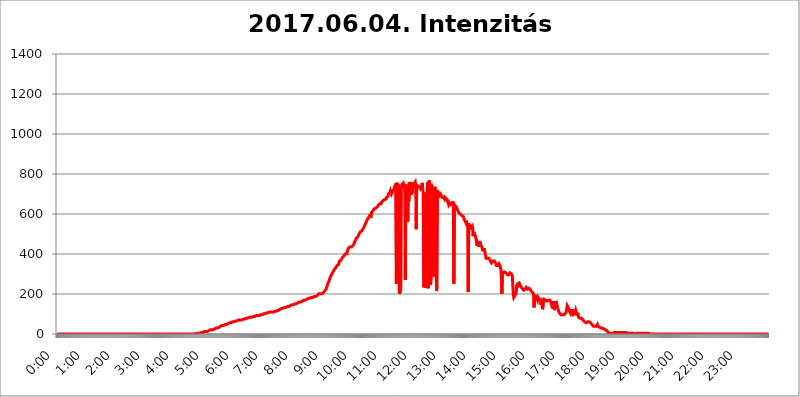
| Category | 2017.06.04. Intenzitás [W/m^2]04 |
|---|---|
| 0.0 | 0 |
| 0.0006944444444444445 | 0 |
| 0.001388888888888889 | 0 |
| 0.0020833333333333333 | 0 |
| 0.002777777777777778 | 0 |
| 0.003472222222222222 | 0 |
| 0.004166666666666667 | 0 |
| 0.004861111111111111 | 0 |
| 0.005555555555555556 | 0 |
| 0.0062499999999999995 | 0 |
| 0.006944444444444444 | 0 |
| 0.007638888888888889 | 0 |
| 0.008333333333333333 | 0 |
| 0.009027777777777779 | 0 |
| 0.009722222222222222 | 0 |
| 0.010416666666666666 | 0 |
| 0.011111111111111112 | 0 |
| 0.011805555555555555 | 0 |
| 0.012499999999999999 | 0 |
| 0.013194444444444444 | 0 |
| 0.013888888888888888 | 0 |
| 0.014583333333333332 | 0 |
| 0.015277777777777777 | 0 |
| 0.015972222222222224 | 0 |
| 0.016666666666666666 | 0 |
| 0.017361111111111112 | 0 |
| 0.018055555555555557 | 0 |
| 0.01875 | 0 |
| 0.019444444444444445 | 0 |
| 0.02013888888888889 | 0 |
| 0.020833333333333332 | 0 |
| 0.02152777777777778 | 0 |
| 0.022222222222222223 | 0 |
| 0.02291666666666667 | 0 |
| 0.02361111111111111 | 0 |
| 0.024305555555555556 | 0 |
| 0.024999999999999998 | 0 |
| 0.025694444444444447 | 0 |
| 0.02638888888888889 | 0 |
| 0.027083333333333334 | 0 |
| 0.027777777777777776 | 0 |
| 0.02847222222222222 | 0 |
| 0.029166666666666664 | 0 |
| 0.029861111111111113 | 0 |
| 0.030555555555555555 | 0 |
| 0.03125 | 0 |
| 0.03194444444444445 | 0 |
| 0.03263888888888889 | 0 |
| 0.03333333333333333 | 0 |
| 0.034027777777777775 | 0 |
| 0.034722222222222224 | 0 |
| 0.035416666666666666 | 0 |
| 0.036111111111111115 | 0 |
| 0.03680555555555556 | 0 |
| 0.0375 | 0 |
| 0.03819444444444444 | 0 |
| 0.03888888888888889 | 0 |
| 0.03958333333333333 | 0 |
| 0.04027777777777778 | 0 |
| 0.04097222222222222 | 0 |
| 0.041666666666666664 | 0 |
| 0.042361111111111106 | 0 |
| 0.04305555555555556 | 0 |
| 0.043750000000000004 | 0 |
| 0.044444444444444446 | 0 |
| 0.04513888888888889 | 0 |
| 0.04583333333333334 | 0 |
| 0.04652777777777778 | 0 |
| 0.04722222222222222 | 0 |
| 0.04791666666666666 | 0 |
| 0.04861111111111111 | 0 |
| 0.049305555555555554 | 0 |
| 0.049999999999999996 | 0 |
| 0.05069444444444445 | 0 |
| 0.051388888888888894 | 0 |
| 0.052083333333333336 | 0 |
| 0.05277777777777778 | 0 |
| 0.05347222222222222 | 0 |
| 0.05416666666666667 | 0 |
| 0.05486111111111111 | 0 |
| 0.05555555555555555 | 0 |
| 0.05625 | 0 |
| 0.05694444444444444 | 0 |
| 0.057638888888888885 | 0 |
| 0.05833333333333333 | 0 |
| 0.05902777777777778 | 0 |
| 0.059722222222222225 | 0 |
| 0.06041666666666667 | 0 |
| 0.061111111111111116 | 0 |
| 0.06180555555555556 | 0 |
| 0.0625 | 0 |
| 0.06319444444444444 | 0 |
| 0.06388888888888888 | 0 |
| 0.06458333333333334 | 0 |
| 0.06527777777777778 | 0 |
| 0.06597222222222222 | 0 |
| 0.06666666666666667 | 0 |
| 0.06736111111111111 | 0 |
| 0.06805555555555555 | 0 |
| 0.06874999999999999 | 0 |
| 0.06944444444444443 | 0 |
| 0.07013888888888889 | 0 |
| 0.07083333333333333 | 0 |
| 0.07152777777777779 | 0 |
| 0.07222222222222223 | 0 |
| 0.07291666666666667 | 0 |
| 0.07361111111111111 | 0 |
| 0.07430555555555556 | 0 |
| 0.075 | 0 |
| 0.07569444444444444 | 0 |
| 0.0763888888888889 | 0 |
| 0.07708333333333334 | 0 |
| 0.07777777777777778 | 0 |
| 0.07847222222222222 | 0 |
| 0.07916666666666666 | 0 |
| 0.0798611111111111 | 0 |
| 0.08055555555555556 | 0 |
| 0.08125 | 0 |
| 0.08194444444444444 | 0 |
| 0.08263888888888889 | 0 |
| 0.08333333333333333 | 0 |
| 0.08402777777777777 | 0 |
| 0.08472222222222221 | 0 |
| 0.08541666666666665 | 0 |
| 0.08611111111111112 | 0 |
| 0.08680555555555557 | 0 |
| 0.08750000000000001 | 0 |
| 0.08819444444444445 | 0 |
| 0.08888888888888889 | 0 |
| 0.08958333333333333 | 0 |
| 0.09027777777777778 | 0 |
| 0.09097222222222222 | 0 |
| 0.09166666666666667 | 0 |
| 0.09236111111111112 | 0 |
| 0.09305555555555556 | 0 |
| 0.09375 | 0 |
| 0.09444444444444444 | 0 |
| 0.09513888888888888 | 0 |
| 0.09583333333333333 | 0 |
| 0.09652777777777777 | 0 |
| 0.09722222222222222 | 0 |
| 0.09791666666666667 | 0 |
| 0.09861111111111111 | 0 |
| 0.09930555555555555 | 0 |
| 0.09999999999999999 | 0 |
| 0.10069444444444443 | 0 |
| 0.1013888888888889 | 0 |
| 0.10208333333333335 | 0 |
| 0.10277777777777779 | 0 |
| 0.10347222222222223 | 0 |
| 0.10416666666666667 | 0 |
| 0.10486111111111111 | 0 |
| 0.10555555555555556 | 0 |
| 0.10625 | 0 |
| 0.10694444444444444 | 0 |
| 0.1076388888888889 | 0 |
| 0.10833333333333334 | 0 |
| 0.10902777777777778 | 0 |
| 0.10972222222222222 | 0 |
| 0.1111111111111111 | 0 |
| 0.11180555555555556 | 0 |
| 0.11180555555555556 | 0 |
| 0.1125 | 0 |
| 0.11319444444444444 | 0 |
| 0.11388888888888889 | 0 |
| 0.11458333333333333 | 0 |
| 0.11527777777777777 | 0 |
| 0.11597222222222221 | 0 |
| 0.11666666666666665 | 0 |
| 0.1173611111111111 | 0 |
| 0.11805555555555557 | 0 |
| 0.11944444444444445 | 0 |
| 0.12013888888888889 | 0 |
| 0.12083333333333333 | 0 |
| 0.12152777777777778 | 0 |
| 0.12222222222222223 | 0 |
| 0.12291666666666667 | 0 |
| 0.12291666666666667 | 0 |
| 0.12361111111111112 | 0 |
| 0.12430555555555556 | 0 |
| 0.125 | 0 |
| 0.12569444444444444 | 0 |
| 0.12638888888888888 | 0 |
| 0.12708333333333333 | 0 |
| 0.16875 | 0 |
| 0.12847222222222224 | 0 |
| 0.12916666666666668 | 0 |
| 0.12986111111111112 | 0 |
| 0.13055555555555556 | 0 |
| 0.13125 | 0 |
| 0.13194444444444445 | 0 |
| 0.1326388888888889 | 0 |
| 0.13333333333333333 | 0 |
| 0.13402777777777777 | 0 |
| 0.13402777777777777 | 0 |
| 0.13472222222222222 | 0 |
| 0.13541666666666666 | 0 |
| 0.1361111111111111 | 0 |
| 0.13749999999999998 | 0 |
| 0.13819444444444443 | 0 |
| 0.1388888888888889 | 0 |
| 0.13958333333333334 | 0 |
| 0.14027777777777778 | 0 |
| 0.14097222222222222 | 0 |
| 0.14166666666666666 | 0 |
| 0.1423611111111111 | 0 |
| 0.14305555555555557 | 0 |
| 0.14375000000000002 | 0 |
| 0.14444444444444446 | 0 |
| 0.1451388888888889 | 0 |
| 0.1451388888888889 | 0 |
| 0.14652777777777778 | 0 |
| 0.14722222222222223 | 0 |
| 0.14791666666666667 | 0 |
| 0.1486111111111111 | 0 |
| 0.14930555555555555 | 0 |
| 0.15 | 0 |
| 0.15069444444444444 | 0 |
| 0.15138888888888888 | 0 |
| 0.15208333333333332 | 0 |
| 0.15277777777777776 | 0 |
| 0.15347222222222223 | 0 |
| 0.15416666666666667 | 0 |
| 0.15486111111111112 | 0 |
| 0.15555555555555556 | 0 |
| 0.15625 | 0 |
| 0.15694444444444444 | 0 |
| 0.15763888888888888 | 0 |
| 0.15833333333333333 | 0 |
| 0.15902777777777777 | 0 |
| 0.15972222222222224 | 0 |
| 0.16041666666666668 | 0 |
| 0.16111111111111112 | 0 |
| 0.16180555555555556 | 0 |
| 0.1625 | 0 |
| 0.16319444444444445 | 0 |
| 0.1638888888888889 | 0 |
| 0.16458333333333333 | 0 |
| 0.16527777777777777 | 0 |
| 0.16597222222222222 | 0 |
| 0.16666666666666666 | 0 |
| 0.1673611111111111 | 0 |
| 0.16805555555555554 | 0 |
| 0.16874999999999998 | 0 |
| 0.16944444444444443 | 0 |
| 0.17013888888888887 | 0 |
| 0.1708333333333333 | 0 |
| 0.17152777777777775 | 0 |
| 0.17222222222222225 | 0 |
| 0.1729166666666667 | 0 |
| 0.17361111111111113 | 0 |
| 0.17430555555555557 | 0 |
| 0.17500000000000002 | 0 |
| 0.17569444444444446 | 0 |
| 0.1763888888888889 | 0 |
| 0.17708333333333334 | 0 |
| 0.17777777777777778 | 0 |
| 0.17847222222222223 | 0 |
| 0.17916666666666667 | 0 |
| 0.1798611111111111 | 0 |
| 0.18055555555555555 | 0 |
| 0.18125 | 0 |
| 0.18194444444444444 | 0 |
| 0.1826388888888889 | 0 |
| 0.18333333333333335 | 0 |
| 0.1840277777777778 | 0 |
| 0.18472222222222223 | 0 |
| 0.18541666666666667 | 0 |
| 0.18611111111111112 | 0 |
| 0.18680555555555556 | 0 |
| 0.1875 | 0 |
| 0.18819444444444444 | 0 |
| 0.18888888888888888 | 0 |
| 0.18958333333333333 | 0 |
| 0.19027777777777777 | 0 |
| 0.1909722222222222 | 0 |
| 0.19166666666666665 | 0 |
| 0.19236111111111112 | 0 |
| 0.19305555555555554 | 0 |
| 0.19375 | 0 |
| 0.19444444444444445 | 0 |
| 0.1951388888888889 | 0 |
| 0.19583333333333333 | 3.525 |
| 0.19652777777777777 | 3.525 |
| 0.19722222222222222 | 3.525 |
| 0.19791666666666666 | 3.525 |
| 0.1986111111111111 | 3.525 |
| 0.19930555555555554 | 3.525 |
| 0.19999999999999998 | 3.525 |
| 0.20069444444444443 | 3.525 |
| 0.20138888888888887 | 3.525 |
| 0.2020833333333333 | 7.887 |
| 0.2027777777777778 | 7.887 |
| 0.2034722222222222 | 7.887 |
| 0.2041666666666667 | 7.887 |
| 0.20486111111111113 | 7.887 |
| 0.20555555555555557 | 7.887 |
| 0.20625000000000002 | 12.257 |
| 0.20694444444444446 | 12.257 |
| 0.2076388888888889 | 12.257 |
| 0.20833333333333334 | 12.257 |
| 0.20902777777777778 | 12.257 |
| 0.20972222222222223 | 12.257 |
| 0.21041666666666667 | 12.257 |
| 0.2111111111111111 | 16.636 |
| 0.21180555555555555 | 12.257 |
| 0.2125 | 16.636 |
| 0.21319444444444444 | 16.636 |
| 0.2138888888888889 | 16.636 |
| 0.21458333333333335 | 21.024 |
| 0.2152777777777778 | 21.024 |
| 0.21597222222222223 | 21.024 |
| 0.21666666666666667 | 21.024 |
| 0.21736111111111112 | 21.024 |
| 0.21805555555555556 | 21.024 |
| 0.21875 | 21.024 |
| 0.21944444444444444 | 25.419 |
| 0.22013888888888888 | 25.419 |
| 0.22083333333333333 | 25.419 |
| 0.22152777777777777 | 25.419 |
| 0.2222222222222222 | 25.419 |
| 0.22291666666666665 | 29.823 |
| 0.2236111111111111 | 29.823 |
| 0.22430555555555556 | 29.823 |
| 0.225 | 29.823 |
| 0.22569444444444445 | 34.234 |
| 0.2263888888888889 | 34.234 |
| 0.22708333333333333 | 34.234 |
| 0.22777777777777777 | 34.234 |
| 0.22847222222222222 | 38.653 |
| 0.22916666666666666 | 38.653 |
| 0.2298611111111111 | 38.653 |
| 0.23055555555555554 | 38.653 |
| 0.23124999999999998 | 43.079 |
| 0.23194444444444443 | 43.079 |
| 0.23263888888888887 | 43.079 |
| 0.2333333333333333 | 43.079 |
| 0.2340277777777778 | 43.079 |
| 0.2347222222222222 | 47.511 |
| 0.2354166666666667 | 47.511 |
| 0.23611111111111113 | 47.511 |
| 0.23680555555555557 | 47.511 |
| 0.23750000000000002 | 47.511 |
| 0.23819444444444446 | 51.951 |
| 0.2388888888888889 | 51.951 |
| 0.23958333333333334 | 51.951 |
| 0.24027777777777778 | 51.951 |
| 0.24097222222222223 | 56.398 |
| 0.24166666666666667 | 56.398 |
| 0.2423611111111111 | 56.398 |
| 0.24305555555555555 | 56.398 |
| 0.24375 | 56.398 |
| 0.24444444444444446 | 60.85 |
| 0.24513888888888888 | 60.85 |
| 0.24583333333333335 | 60.85 |
| 0.2465277777777778 | 60.85 |
| 0.24722222222222223 | 60.85 |
| 0.24791666666666667 | 60.85 |
| 0.24861111111111112 | 60.85 |
| 0.24930555555555556 | 60.85 |
| 0.25 | 65.31 |
| 0.25069444444444444 | 65.31 |
| 0.2513888888888889 | 65.31 |
| 0.2520833333333333 | 65.31 |
| 0.25277777777777777 | 65.31 |
| 0.2534722222222222 | 65.31 |
| 0.25416666666666665 | 69.775 |
| 0.2548611111111111 | 69.775 |
| 0.2555555555555556 | 69.775 |
| 0.25625000000000003 | 69.775 |
| 0.2569444444444445 | 69.775 |
| 0.2576388888888889 | 69.775 |
| 0.25833333333333336 | 69.775 |
| 0.2590277777777778 | 74.246 |
| 0.25972222222222224 | 74.246 |
| 0.2604166666666667 | 74.246 |
| 0.2611111111111111 | 74.246 |
| 0.26180555555555557 | 74.246 |
| 0.2625 | 74.246 |
| 0.26319444444444445 | 74.246 |
| 0.2638888888888889 | 74.246 |
| 0.26458333333333334 | 78.722 |
| 0.2652777777777778 | 78.722 |
| 0.2659722222222222 | 78.722 |
| 0.26666666666666666 | 78.722 |
| 0.2673611111111111 | 78.722 |
| 0.26805555555555555 | 78.722 |
| 0.26875 | 83.205 |
| 0.26944444444444443 | 83.205 |
| 0.2701388888888889 | 83.205 |
| 0.2708333333333333 | 83.205 |
| 0.27152777777777776 | 83.205 |
| 0.2722222222222222 | 83.205 |
| 0.27291666666666664 | 83.205 |
| 0.2736111111111111 | 87.692 |
| 0.2743055555555555 | 87.692 |
| 0.27499999999999997 | 87.692 |
| 0.27569444444444446 | 87.692 |
| 0.27638888888888885 | 87.692 |
| 0.27708333333333335 | 87.692 |
| 0.2777777777777778 | 87.692 |
| 0.27847222222222223 | 92.184 |
| 0.2791666666666667 | 92.184 |
| 0.2798611111111111 | 92.184 |
| 0.28055555555555556 | 92.184 |
| 0.28125 | 92.184 |
| 0.28194444444444444 | 92.184 |
| 0.2826388888888889 | 92.184 |
| 0.2833333333333333 | 92.184 |
| 0.28402777777777777 | 96.682 |
| 0.2847222222222222 | 96.682 |
| 0.28541666666666665 | 96.682 |
| 0.28611111111111115 | 96.682 |
| 0.28680555555555554 | 96.682 |
| 0.28750000000000003 | 96.682 |
| 0.2881944444444445 | 101.184 |
| 0.2888888888888889 | 101.184 |
| 0.28958333333333336 | 101.184 |
| 0.2902777777777778 | 101.184 |
| 0.29097222222222224 | 101.184 |
| 0.2916666666666667 | 101.184 |
| 0.2923611111111111 | 101.184 |
| 0.29305555555555557 | 105.69 |
| 0.29375 | 105.69 |
| 0.29444444444444445 | 105.69 |
| 0.2951388888888889 | 105.69 |
| 0.29583333333333334 | 105.69 |
| 0.2965277777777778 | 105.69 |
| 0.2972222222222222 | 105.69 |
| 0.29791666666666666 | 110.201 |
| 0.2986111111111111 | 110.201 |
| 0.29930555555555555 | 110.201 |
| 0.3 | 110.201 |
| 0.30069444444444443 | 110.201 |
| 0.3013888888888889 | 110.201 |
| 0.3020833333333333 | 110.201 |
| 0.30277777777777776 | 110.201 |
| 0.3034722222222222 | 110.201 |
| 0.30416666666666664 | 110.201 |
| 0.3048611111111111 | 110.201 |
| 0.3055555555555555 | 114.716 |
| 0.30624999999999997 | 114.716 |
| 0.3069444444444444 | 114.716 |
| 0.3076388888888889 | 114.716 |
| 0.30833333333333335 | 114.716 |
| 0.3090277777777778 | 119.235 |
| 0.30972222222222223 | 119.235 |
| 0.3104166666666667 | 119.235 |
| 0.3111111111111111 | 119.235 |
| 0.31180555555555556 | 123.758 |
| 0.3125 | 123.758 |
| 0.31319444444444444 | 123.758 |
| 0.3138888888888889 | 128.284 |
| 0.3145833333333333 | 128.284 |
| 0.31527777777777777 | 128.284 |
| 0.3159722222222222 | 128.284 |
| 0.31666666666666665 | 128.284 |
| 0.31736111111111115 | 128.284 |
| 0.31805555555555554 | 132.814 |
| 0.31875000000000003 | 132.814 |
| 0.3194444444444445 | 132.814 |
| 0.3201388888888889 | 132.814 |
| 0.32083333333333336 | 132.814 |
| 0.3215277777777778 | 132.814 |
| 0.32222222222222224 | 132.814 |
| 0.3229166666666667 | 137.347 |
| 0.3236111111111111 | 137.347 |
| 0.32430555555555557 | 137.347 |
| 0.325 | 137.347 |
| 0.32569444444444445 | 137.347 |
| 0.3263888888888889 | 141.884 |
| 0.32708333333333334 | 141.884 |
| 0.3277777777777778 | 141.884 |
| 0.3284722222222222 | 141.884 |
| 0.32916666666666666 | 146.423 |
| 0.3298611111111111 | 146.423 |
| 0.33055555555555555 | 146.423 |
| 0.33125 | 146.423 |
| 0.33194444444444443 | 146.423 |
| 0.3326388888888889 | 150.964 |
| 0.3333333333333333 | 150.964 |
| 0.3340277777777778 | 150.964 |
| 0.3347222222222222 | 150.964 |
| 0.3354166666666667 | 150.964 |
| 0.3361111111111111 | 155.509 |
| 0.3368055555555556 | 155.509 |
| 0.33749999999999997 | 155.509 |
| 0.33819444444444446 | 155.509 |
| 0.33888888888888885 | 155.509 |
| 0.33958333333333335 | 160.056 |
| 0.34027777777777773 | 160.056 |
| 0.34097222222222223 | 160.056 |
| 0.3416666666666666 | 160.056 |
| 0.3423611111111111 | 164.605 |
| 0.3430555555555555 | 164.605 |
| 0.34375 | 164.605 |
| 0.3444444444444445 | 164.605 |
| 0.3451388888888889 | 164.605 |
| 0.3458333333333334 | 169.156 |
| 0.34652777777777777 | 169.156 |
| 0.34722222222222227 | 169.156 |
| 0.34791666666666665 | 169.156 |
| 0.34861111111111115 | 173.709 |
| 0.34930555555555554 | 173.709 |
| 0.35000000000000003 | 173.709 |
| 0.3506944444444444 | 173.709 |
| 0.3513888888888889 | 173.709 |
| 0.3520833333333333 | 178.264 |
| 0.3527777777777778 | 178.264 |
| 0.3534722222222222 | 178.264 |
| 0.3541666666666667 | 178.264 |
| 0.3548611111111111 | 182.82 |
| 0.35555555555555557 | 182.82 |
| 0.35625 | 182.82 |
| 0.35694444444444445 | 182.82 |
| 0.3576388888888889 | 182.82 |
| 0.35833333333333334 | 182.82 |
| 0.3590277777777778 | 187.378 |
| 0.3597222222222222 | 187.378 |
| 0.36041666666666666 | 187.378 |
| 0.3611111111111111 | 182.82 |
| 0.36180555555555555 | 182.82 |
| 0.3625 | 187.378 |
| 0.36319444444444443 | 191.937 |
| 0.3638888888888889 | 191.937 |
| 0.3645833333333333 | 191.937 |
| 0.3652777777777778 | 191.937 |
| 0.3659722222222222 | 196.497 |
| 0.3666666666666667 | 201.058 |
| 0.3673611111111111 | 201.058 |
| 0.3680555555555556 | 201.058 |
| 0.36874999999999997 | 201.058 |
| 0.36944444444444446 | 201.058 |
| 0.37013888888888885 | 201.058 |
| 0.37083333333333335 | 201.058 |
| 0.37152777777777773 | 205.62 |
| 0.37222222222222223 | 205.62 |
| 0.3729166666666666 | 205.62 |
| 0.3736111111111111 | 210.182 |
| 0.3743055555555555 | 210.182 |
| 0.375 | 214.746 |
| 0.3756944444444445 | 219.309 |
| 0.3763888888888889 | 219.309 |
| 0.3770833333333334 | 223.873 |
| 0.37777777777777777 | 233 |
| 0.37847222222222227 | 237.564 |
| 0.37916666666666665 | 246.689 |
| 0.37986111111111115 | 255.813 |
| 0.38055555555555554 | 260.373 |
| 0.38125000000000003 | 264.932 |
| 0.3819444444444444 | 274.047 |
| 0.3826388888888889 | 278.603 |
| 0.3833333333333333 | 287.709 |
| 0.3840277777777778 | 292.259 |
| 0.3847222222222222 | 296.808 |
| 0.3854166666666667 | 296.808 |
| 0.3861111111111111 | 305.898 |
| 0.38680555555555557 | 310.44 |
| 0.3875 | 314.98 |
| 0.38819444444444445 | 314.98 |
| 0.3888888888888889 | 324.052 |
| 0.38958333333333334 | 328.584 |
| 0.3902777777777778 | 328.584 |
| 0.3909722222222222 | 333.113 |
| 0.39166666666666666 | 337.639 |
| 0.3923611111111111 | 342.162 |
| 0.39305555555555555 | 342.162 |
| 0.39375 | 346.682 |
| 0.39444444444444443 | 346.682 |
| 0.3951388888888889 | 355.712 |
| 0.3958333333333333 | 364.728 |
| 0.3965277777777778 | 360.221 |
| 0.3972222222222222 | 364.728 |
| 0.3979166666666667 | 369.23 |
| 0.3986111111111111 | 369.23 |
| 0.3993055555555556 | 373.729 |
| 0.39999999999999997 | 382.715 |
| 0.40069444444444446 | 378.224 |
| 0.40138888888888885 | 387.202 |
| 0.40208333333333335 | 391.685 |
| 0.40277777777777773 | 396.164 |
| 0.40347222222222223 | 396.164 |
| 0.4041666666666666 | 400.638 |
| 0.4048611111111111 | 400.638 |
| 0.4055555555555555 | 405.108 |
| 0.40625 | 400.638 |
| 0.4069444444444445 | 414.035 |
| 0.4076388888888889 | 422.943 |
| 0.4083333333333334 | 422.943 |
| 0.40902777777777777 | 431.833 |
| 0.40972222222222227 | 431.833 |
| 0.41041666666666665 | 431.833 |
| 0.41111111111111115 | 436.27 |
| 0.41180555555555554 | 436.27 |
| 0.41250000000000003 | 436.27 |
| 0.4131944444444444 | 436.27 |
| 0.4138888888888889 | 440.702 |
| 0.4145833333333333 | 440.702 |
| 0.4152777777777778 | 445.129 |
| 0.4159722222222222 | 449.551 |
| 0.4166666666666667 | 453.968 |
| 0.4173611111111111 | 462.786 |
| 0.41805555555555557 | 467.187 |
| 0.41875 | 471.582 |
| 0.41944444444444445 | 480.356 |
| 0.4201388888888889 | 480.356 |
| 0.42083333333333334 | 484.735 |
| 0.4215277777777778 | 484.735 |
| 0.4222222222222222 | 484.735 |
| 0.42291666666666666 | 497.836 |
| 0.4236111111111111 | 502.192 |
| 0.42430555555555555 | 502.192 |
| 0.425 | 510.885 |
| 0.42569444444444443 | 515.223 |
| 0.4263888888888889 | 510.885 |
| 0.4270833333333333 | 515.223 |
| 0.4277777777777778 | 519.555 |
| 0.4284722222222222 | 519.555 |
| 0.4291666666666667 | 528.2 |
| 0.4298611111111111 | 532.513 |
| 0.4305555555555556 | 536.82 |
| 0.43124999999999997 | 541.121 |
| 0.43194444444444446 | 549.704 |
| 0.43263888888888885 | 553.986 |
| 0.43333333333333335 | 558.261 |
| 0.43402777777777773 | 566.793 |
| 0.43472222222222223 | 566.793 |
| 0.4354166666666666 | 575.299 |
| 0.4361111111111111 | 575.299 |
| 0.4368055555555555 | 583.779 |
| 0.4375 | 583.779 |
| 0.4381944444444445 | 592.233 |
| 0.4388888888888889 | 592.233 |
| 0.4395833333333334 | 596.45 |
| 0.44027777777777777 | 588.009 |
| 0.44097222222222227 | 609.062 |
| 0.44166666666666665 | 613.252 |
| 0.44236111111111115 | 613.252 |
| 0.44305555555555554 | 617.436 |
| 0.44375000000000003 | 621.613 |
| 0.4444444444444444 | 625.784 |
| 0.4451388888888889 | 625.784 |
| 0.4458333333333333 | 629.948 |
| 0.4465277777777778 | 629.948 |
| 0.4472222222222222 | 634.105 |
| 0.4479166666666667 | 634.105 |
| 0.4486111111111111 | 634.105 |
| 0.44930555555555557 | 638.256 |
| 0.45 | 642.4 |
| 0.45069444444444445 | 642.4 |
| 0.4513888888888889 | 646.537 |
| 0.45208333333333334 | 650.667 |
| 0.4527777777777778 | 654.791 |
| 0.4534722222222222 | 654.791 |
| 0.45416666666666666 | 650.667 |
| 0.4548611111111111 | 658.909 |
| 0.45555555555555555 | 658.909 |
| 0.45625 | 658.909 |
| 0.45694444444444443 | 667.123 |
| 0.4576388888888889 | 667.123 |
| 0.4583333333333333 | 667.123 |
| 0.4590277777777778 | 671.22 |
| 0.4597222222222222 | 671.22 |
| 0.4604166666666667 | 675.311 |
| 0.4611111111111111 | 675.311 |
| 0.4618055555555556 | 683.473 |
| 0.46249999999999997 | 679.395 |
| 0.46319444444444446 | 683.473 |
| 0.46388888888888885 | 687.544 |
| 0.46458333333333335 | 699.717 |
| 0.46527777777777773 | 695.666 |
| 0.46597222222222223 | 703.762 |
| 0.4666666666666666 | 707.8 |
| 0.4673611111111111 | 715.858 |
| 0.4680555555555555 | 711.832 |
| 0.46875 | 699.717 |
| 0.4694444444444445 | 703.762 |
| 0.4701388888888889 | 703.762 |
| 0.4708333333333334 | 715.858 |
| 0.47152777777777777 | 711.832 |
| 0.47222222222222227 | 723.889 |
| 0.47291666666666665 | 723.889 |
| 0.47361111111111115 | 739.877 |
| 0.47430555555555554 | 735.89 |
| 0.47500000000000003 | 751.803 |
| 0.4756944444444444 | 251.251 |
| 0.4763888888888889 | 755.766 |
| 0.4770833333333333 | 575.299 |
| 0.4777777777777778 | 747.834 |
| 0.4784722222222222 | 751.803 |
| 0.4791666666666667 | 731.896 |
| 0.4798611111111111 | 201.058 |
| 0.48055555555555557 | 201.058 |
| 0.48125 | 214.746 |
| 0.48194444444444445 | 242.127 |
| 0.4826388888888889 | 735.89 |
| 0.48333333333333334 | 747.834 |
| 0.4840277777777778 | 747.834 |
| 0.4847222222222222 | 747.834 |
| 0.48541666666666666 | 755.766 |
| 0.4861111111111111 | 755.766 |
| 0.48680555555555555 | 739.877 |
| 0.4875 | 715.858 |
| 0.48819444444444443 | 269.49 |
| 0.4888888888888889 | 747.834 |
| 0.4895833333333333 | 747.834 |
| 0.4902777777777778 | 743.859 |
| 0.4909722222222222 | 646.537 |
| 0.4916666666666667 | 562.53 |
| 0.4923611111111111 | 735.89 |
| 0.4930555555555556 | 663.019 |
| 0.49374999999999997 | 759.723 |
| 0.49444444444444446 | 759.723 |
| 0.49513888888888885 | 743.859 |
| 0.49583333333333335 | 755.766 |
| 0.49652777777777773 | 695.666 |
| 0.49722222222222223 | 759.723 |
| 0.4979166666666666 | 703.762 |
| 0.4986111111111111 | 743.859 |
| 0.4993055555555555 | 731.896 |
| 0.5 | 735.89 |
| 0.5006944444444444 | 751.803 |
| 0.5013888888888889 | 755.766 |
| 0.5020833333333333 | 759.723 |
| 0.5027777777777778 | 739.877 |
| 0.5034722222222222 | 523.88 |
| 0.5041666666666667 | 747.834 |
| 0.5048611111111111 | 731.896 |
| 0.5055555555555555 | 731.896 |
| 0.50625 | 731.896 |
| 0.5069444444444444 | 735.89 |
| 0.5076388888888889 | 739.877 |
| 0.5083333333333333 | 739.877 |
| 0.5090277777777777 | 735.89 |
| 0.5097222222222222 | 727.896 |
| 0.5104166666666666 | 727.896 |
| 0.5111111111111112 | 735.89 |
| 0.5118055555555555 | 755.766 |
| 0.5125000000000001 | 723.889 |
| 0.5131944444444444 | 707.8 |
| 0.513888888888889 | 233 |
| 0.5145833333333333 | 233 |
| 0.5152777777777778 | 242.127 |
| 0.5159722222222222 | 707.8 |
| 0.5166666666666667 | 233 |
| 0.517361111111111 | 237.564 |
| 0.5180555555555556 | 233 |
| 0.5187499999999999 | 699.717 |
| 0.5194444444444445 | 759.723 |
| 0.5201388888888888 | 228.436 |
| 0.5208333333333334 | 223.873 |
| 0.5215277777777778 | 767.62 |
| 0.5222222222222223 | 755.766 |
| 0.5229166666666667 | 751.803 |
| 0.5236111111111111 | 246.689 |
| 0.5243055555555556 | 287.709 |
| 0.525 | 727.896 |
| 0.5256944444444445 | 735.89 |
| 0.5263888888888889 | 727.896 |
| 0.5270833333333333 | 711.832 |
| 0.5277777777777778 | 287.709 |
| 0.5284722222222222 | 727.896 |
| 0.5291666666666667 | 715.858 |
| 0.5298611111111111 | 735.89 |
| 0.5305555555555556 | 703.762 |
| 0.53125 | 400.638 |
| 0.5319444444444444 | 214.746 |
| 0.5326388888888889 | 237.564 |
| 0.5333333333333333 | 719.877 |
| 0.5340277777777778 | 707.8 |
| 0.5347222222222222 | 699.717 |
| 0.5354166666666667 | 695.666 |
| 0.5361111111111111 | 691.608 |
| 0.5368055555555555 | 695.666 |
| 0.5375 | 699.717 |
| 0.5381944444444444 | 695.666 |
| 0.5388888888888889 | 691.608 |
| 0.5395833333333333 | 683.473 |
| 0.5402777777777777 | 679.395 |
| 0.5409722222222222 | 683.473 |
| 0.5416666666666666 | 683.473 |
| 0.5423611111111112 | 679.395 |
| 0.5430555555555555 | 675.311 |
| 0.5437500000000001 | 683.473 |
| 0.5444444444444444 | 679.395 |
| 0.545138888888889 | 683.473 |
| 0.5458333333333333 | 675.311 |
| 0.5465277777777778 | 671.22 |
| 0.5472222222222222 | 671.22 |
| 0.5479166666666667 | 658.909 |
| 0.548611111111111 | 650.667 |
| 0.5493055555555556 | 658.909 |
| 0.5499999999999999 | 654.791 |
| 0.5506944444444445 | 654.791 |
| 0.5513888888888888 | 646.537 |
| 0.5520833333333334 | 642.4 |
| 0.5527777777777778 | 646.537 |
| 0.5534722222222223 | 650.667 |
| 0.5541666666666667 | 654.791 |
| 0.5548611111111111 | 663.019 |
| 0.5555555555555556 | 642.4 |
| 0.55625 | 251.251 |
| 0.5569444444444445 | 646.537 |
| 0.5576388888888889 | 642.4 |
| 0.5583333333333333 | 642.4 |
| 0.5590277777777778 | 638.256 |
| 0.5597222222222222 | 638.256 |
| 0.5604166666666667 | 629.948 |
| 0.5611111111111111 | 625.784 |
| 0.5618055555555556 | 617.436 |
| 0.5625 | 613.252 |
| 0.5631944444444444 | 604.864 |
| 0.5638888888888889 | 604.864 |
| 0.5645833333333333 | 609.062 |
| 0.5652777777777778 | 600.661 |
| 0.5659722222222222 | 600.661 |
| 0.5666666666666667 | 596.45 |
| 0.5673611111111111 | 592.233 |
| 0.5680555555555555 | 596.45 |
| 0.56875 | 588.009 |
| 0.5694444444444444 | 588.009 |
| 0.5701388888888889 | 583.779 |
| 0.5708333333333333 | 571.049 |
| 0.5715277777777777 | 571.049 |
| 0.5722222222222222 | 571.049 |
| 0.5729166666666666 | 558.261 |
| 0.5736111111111112 | 566.793 |
| 0.5743055555555555 | 571.049 |
| 0.5750000000000001 | 566.793 |
| 0.5756944444444444 | 532.513 |
| 0.576388888888889 | 210.182 |
| 0.5770833333333333 | 553.986 |
| 0.5777777777777778 | 528.2 |
| 0.5784722222222222 | 545.416 |
| 0.5791666666666667 | 523.88 |
| 0.579861111111111 | 532.513 |
| 0.5805555555555556 | 536.82 |
| 0.5812499999999999 | 536.82 |
| 0.5819444444444445 | 541.121 |
| 0.5826388888888888 | 532.513 |
| 0.5833333333333334 | 489.108 |
| 0.5840277777777778 | 510.885 |
| 0.5847222222222223 | 510.885 |
| 0.5854166666666667 | 497.836 |
| 0.5861111111111111 | 493.475 |
| 0.5868055555555556 | 489.108 |
| 0.5875 | 471.582 |
| 0.5881944444444445 | 458.38 |
| 0.5888888888888889 | 440.702 |
| 0.5895833333333333 | 458.38 |
| 0.5902777777777778 | 453.968 |
| 0.5909722222222222 | 449.551 |
| 0.5916666666666667 | 436.27 |
| 0.5923611111111111 | 445.129 |
| 0.5930555555555556 | 462.786 |
| 0.59375 | 449.551 |
| 0.5944444444444444 | 445.129 |
| 0.5951388888888889 | 445.129 |
| 0.5958333333333333 | 431.833 |
| 0.5965277777777778 | 414.035 |
| 0.5972222222222222 | 422.943 |
| 0.5979166666666667 | 422.943 |
| 0.5986111111111111 | 418.492 |
| 0.5993055555555555 | 422.943 |
| 0.6 | 405.108 |
| 0.6006944444444444 | 396.164 |
| 0.6013888888888889 | 378.224 |
| 0.6020833333333333 | 382.715 |
| 0.6027777777777777 | 378.224 |
| 0.6034722222222222 | 378.224 |
| 0.6041666666666666 | 378.224 |
| 0.6048611111111112 | 378.224 |
| 0.6055555555555555 | 378.224 |
| 0.6062500000000001 | 378.224 |
| 0.6069444444444444 | 369.23 |
| 0.607638888888889 | 369.23 |
| 0.6083333333333333 | 364.728 |
| 0.6090277777777778 | 355.712 |
| 0.6097222222222222 | 355.712 |
| 0.6104166666666667 | 355.712 |
| 0.611111111111111 | 364.728 |
| 0.6118055555555556 | 369.23 |
| 0.6124999999999999 | 369.23 |
| 0.6131944444444445 | 364.728 |
| 0.6138888888888888 | 360.221 |
| 0.6145833333333334 | 355.712 |
| 0.6152777777777778 | 351.198 |
| 0.6159722222222223 | 342.162 |
| 0.6166666666666667 | 337.639 |
| 0.6173611111111111 | 342.162 |
| 0.6180555555555556 | 342.162 |
| 0.61875 | 346.682 |
| 0.6194444444444445 | 351.198 |
| 0.6201388888888889 | 351.198 |
| 0.6208333333333333 | 342.162 |
| 0.6215277777777778 | 333.113 |
| 0.6222222222222222 | 324.052 |
| 0.6229166666666667 | 278.603 |
| 0.6236111111111111 | 201.058 |
| 0.6243055555555556 | 296.808 |
| 0.625 | 305.898 |
| 0.6256944444444444 | 310.44 |
| 0.6263888888888889 | 310.44 |
| 0.6270833333333333 | 310.44 |
| 0.6277777777777778 | 305.898 |
| 0.6284722222222222 | 305.898 |
| 0.6291666666666667 | 305.898 |
| 0.6298611111111111 | 301.354 |
| 0.6305555555555555 | 301.354 |
| 0.63125 | 296.808 |
| 0.6319444444444444 | 296.808 |
| 0.6326388888888889 | 296.808 |
| 0.6333333333333333 | 296.808 |
| 0.6340277777777777 | 301.354 |
| 0.6347222222222222 | 305.898 |
| 0.6354166666666666 | 305.898 |
| 0.6361111111111112 | 301.354 |
| 0.6368055555555555 | 301.354 |
| 0.6375000000000001 | 296.808 |
| 0.6381944444444444 | 292.259 |
| 0.638888888888889 | 287.709 |
| 0.6395833333333333 | 196.497 |
| 0.6402777777777778 | 182.82 |
| 0.6409722222222222 | 187.378 |
| 0.6416666666666667 | 191.937 |
| 0.642361111111111 | 191.937 |
| 0.6430555555555556 | 196.497 |
| 0.6437499999999999 | 205.62 |
| 0.6444444444444445 | 246.689 |
| 0.6451388888888888 | 233 |
| 0.6458333333333334 | 251.251 |
| 0.6465277777777778 | 251.251 |
| 0.6472222222222223 | 251.251 |
| 0.6479166666666667 | 255.813 |
| 0.6486111111111111 | 251.251 |
| 0.6493055555555556 | 246.689 |
| 0.65 | 237.564 |
| 0.6506944444444445 | 233 |
| 0.6513888888888889 | 233 |
| 0.6520833333333333 | 228.436 |
| 0.6527777777777778 | 223.873 |
| 0.6534722222222222 | 223.873 |
| 0.6541666666666667 | 219.309 |
| 0.6548611111111111 | 223.873 |
| 0.6555555555555556 | 219.309 |
| 0.65625 | 223.873 |
| 0.6569444444444444 | 228.436 |
| 0.6576388888888889 | 233 |
| 0.6583333333333333 | 228.436 |
| 0.6590277777777778 | 228.436 |
| 0.6597222222222222 | 223.873 |
| 0.6604166666666667 | 223.873 |
| 0.6611111111111111 | 228.436 |
| 0.6618055555555555 | 228.436 |
| 0.6625 | 228.436 |
| 0.6631944444444444 | 223.873 |
| 0.6638888888888889 | 219.309 |
| 0.6645833333333333 | 214.746 |
| 0.6652777777777777 | 214.746 |
| 0.6659722222222222 | 210.182 |
| 0.6666666666666666 | 210.182 |
| 0.6673611111111111 | 205.62 |
| 0.6680555555555556 | 201.058 |
| 0.6687500000000001 | 132.814 |
| 0.6694444444444444 | 191.937 |
| 0.6701388888888888 | 191.937 |
| 0.6708333333333334 | 191.937 |
| 0.6715277777777778 | 187.378 |
| 0.6722222222222222 | 182.82 |
| 0.6729166666666666 | 187.378 |
| 0.6736111111111112 | 169.156 |
| 0.6743055555555556 | 182.82 |
| 0.6749999999999999 | 182.82 |
| 0.6756944444444444 | 173.709 |
| 0.6763888888888889 | 178.264 |
| 0.6770833333333334 | 178.264 |
| 0.6777777777777777 | 173.709 |
| 0.6784722222222223 | 146.423 |
| 0.6791666666666667 | 173.709 |
| 0.6798611111111111 | 150.964 |
| 0.6805555555555555 | 123.758 |
| 0.68125 | 132.814 |
| 0.6819444444444445 | 155.509 |
| 0.6826388888888889 | 173.709 |
| 0.6833333333333332 | 173.709 |
| 0.6840277777777778 | 173.709 |
| 0.6847222222222222 | 169.156 |
| 0.6854166666666667 | 169.156 |
| 0.686111111111111 | 164.605 |
| 0.6868055555555556 | 164.605 |
| 0.6875 | 164.605 |
| 0.6881944444444444 | 164.605 |
| 0.688888888888889 | 169.156 |
| 0.6895833333333333 | 169.156 |
| 0.6902777777777778 | 169.156 |
| 0.6909722222222222 | 169.156 |
| 0.6916666666666668 | 164.605 |
| 0.6923611111111111 | 160.056 |
| 0.6930555555555555 | 155.509 |
| 0.69375 | 155.509 |
| 0.6944444444444445 | 128.284 |
| 0.6951388888888889 | 141.884 |
| 0.6958333333333333 | 164.605 |
| 0.6965277777777777 | 141.884 |
| 0.6972222222222223 | 119.235 |
| 0.6979166666666666 | 119.235 |
| 0.6986111111111111 | 141.884 |
| 0.6993055555555556 | 164.605 |
| 0.7000000000000001 | 137.347 |
| 0.7006944444444444 | 146.423 |
| 0.7013888888888888 | 141.884 |
| 0.7020833333333334 | 150.964 |
| 0.7027777777777778 | 119.235 |
| 0.7034722222222222 | 114.716 |
| 0.7041666666666666 | 105.69 |
| 0.7048611111111112 | 101.184 |
| 0.7055555555555556 | 101.184 |
| 0.7062499999999999 | 96.682 |
| 0.7069444444444444 | 92.184 |
| 0.7076388888888889 | 96.682 |
| 0.7083333333333334 | 96.682 |
| 0.7090277777777777 | 96.682 |
| 0.7097222222222223 | 96.682 |
| 0.7104166666666667 | 96.682 |
| 0.7111111111111111 | 101.184 |
| 0.7118055555555555 | 101.184 |
| 0.7125 | 101.184 |
| 0.7131944444444445 | 105.69 |
| 0.7138888888888889 | 110.201 |
| 0.7145833333333332 | 110.201 |
| 0.7152777777777778 | 141.884 |
| 0.7159722222222222 | 137.347 |
| 0.7166666666666667 | 132.814 |
| 0.717361111111111 | 132.814 |
| 0.7180555555555556 | 132.814 |
| 0.71875 | 110.201 |
| 0.7194444444444444 | 110.201 |
| 0.720138888888889 | 101.184 |
| 0.7208333333333333 | 96.682 |
| 0.7215277777777778 | 110.201 |
| 0.7222222222222222 | 123.758 |
| 0.7229166666666668 | 114.716 |
| 0.7236111111111111 | 96.682 |
| 0.7243055555555555 | 96.682 |
| 0.725 | 101.184 |
| 0.7256944444444445 | 101.184 |
| 0.7263888888888889 | 101.184 |
| 0.7270833333333333 | 119.235 |
| 0.7277777777777777 | 119.235 |
| 0.7284722222222223 | 119.235 |
| 0.7291666666666666 | 92.184 |
| 0.7298611111111111 | 105.69 |
| 0.7305555555555556 | 96.682 |
| 0.7312500000000001 | 83.205 |
| 0.7319444444444444 | 83.205 |
| 0.7326388888888888 | 78.722 |
| 0.7333333333333334 | 78.722 |
| 0.7340277777777778 | 78.722 |
| 0.7347222222222222 | 78.722 |
| 0.7354166666666666 | 78.722 |
| 0.7361111111111112 | 78.722 |
| 0.7368055555555556 | 74.246 |
| 0.7374999999999999 | 69.775 |
| 0.7381944444444444 | 65.31 |
| 0.7388888888888889 | 65.31 |
| 0.7395833333333334 | 60.85 |
| 0.7402777777777777 | 60.85 |
| 0.7409722222222223 | 56.398 |
| 0.7416666666666667 | 56.398 |
| 0.7423611111111111 | 56.398 |
| 0.7430555555555555 | 56.398 |
| 0.74375 | 60.85 |
| 0.7444444444444445 | 56.398 |
| 0.7451388888888889 | 60.85 |
| 0.7458333333333332 | 60.85 |
| 0.7465277777777778 | 60.85 |
| 0.7472222222222222 | 56.398 |
| 0.7479166666666667 | 56.398 |
| 0.748611111111111 | 56.398 |
| 0.7493055555555556 | 51.951 |
| 0.75 | 47.511 |
| 0.7506944444444444 | 47.511 |
| 0.751388888888889 | 43.079 |
| 0.7520833333333333 | 38.653 |
| 0.7527777777777778 | 38.653 |
| 0.7534722222222222 | 38.653 |
| 0.7541666666666668 | 38.653 |
| 0.7548611111111111 | 34.234 |
| 0.7555555555555555 | 34.234 |
| 0.75625 | 38.653 |
| 0.7569444444444445 | 38.653 |
| 0.7576388888888889 | 47.511 |
| 0.7583333333333333 | 38.653 |
| 0.7590277777777777 | 34.234 |
| 0.7597222222222223 | 34.234 |
| 0.7604166666666666 | 34.234 |
| 0.7611111111111111 | 34.234 |
| 0.7618055555555556 | 29.823 |
| 0.7625000000000001 | 29.823 |
| 0.7631944444444444 | 29.823 |
| 0.7638888888888888 | 29.823 |
| 0.7645833333333334 | 29.823 |
| 0.7652777777777778 | 29.823 |
| 0.7659722222222222 | 29.823 |
| 0.7666666666666666 | 25.419 |
| 0.7673611111111112 | 25.419 |
| 0.7680555555555556 | 25.419 |
| 0.7687499999999999 | 21.024 |
| 0.7694444444444444 | 21.024 |
| 0.7701388888888889 | 21.024 |
| 0.7708333333333334 | 16.636 |
| 0.7715277777777777 | 12.257 |
| 0.7722222222222223 | 12.257 |
| 0.7729166666666667 | 7.887 |
| 0.7736111111111111 | 7.887 |
| 0.7743055555555555 | 7.887 |
| 0.775 | 3.525 |
| 0.7756944444444445 | 3.525 |
| 0.7763888888888889 | 3.525 |
| 0.7770833333333332 | 3.525 |
| 0.7777777777777778 | 3.525 |
| 0.7784722222222222 | 3.525 |
| 0.7791666666666667 | 3.525 |
| 0.779861111111111 | 3.525 |
| 0.7805555555555556 | 7.887 |
| 0.78125 | 7.887 |
| 0.7819444444444444 | 7.887 |
| 0.782638888888889 | 7.887 |
| 0.7833333333333333 | 7.887 |
| 0.7840277777777778 | 7.887 |
| 0.7847222222222222 | 7.887 |
| 0.7854166666666668 | 7.887 |
| 0.7861111111111111 | 7.887 |
| 0.7868055555555555 | 7.887 |
| 0.7875 | 7.887 |
| 0.7881944444444445 | 7.887 |
| 0.7888888888888889 | 7.887 |
| 0.7895833333333333 | 7.887 |
| 0.7902777777777777 | 7.887 |
| 0.7909722222222223 | 7.887 |
| 0.7916666666666666 | 7.887 |
| 0.7923611111111111 | 7.887 |
| 0.7930555555555556 | 7.887 |
| 0.7937500000000001 | 7.887 |
| 0.7944444444444444 | 7.887 |
| 0.7951388888888888 | 7.887 |
| 0.7958333333333334 | 7.887 |
| 0.7965277777777778 | 7.887 |
| 0.7972222222222222 | 3.525 |
| 0.7979166666666666 | 7.887 |
| 0.7986111111111112 | 3.525 |
| 0.7993055555555556 | 3.525 |
| 0.7999999999999999 | 3.525 |
| 0.8006944444444444 | 3.525 |
| 0.8013888888888889 | 3.525 |
| 0.8020833333333334 | 3.525 |
| 0.8027777777777777 | 3.525 |
| 0.8034722222222223 | 3.525 |
| 0.8041666666666667 | 3.525 |
| 0.8048611111111111 | 3.525 |
| 0.8055555555555555 | 3.525 |
| 0.80625 | 3.525 |
| 0.8069444444444445 | 3.525 |
| 0.8076388888888889 | 3.525 |
| 0.8083333333333332 | 3.525 |
| 0.8090277777777778 | 0 |
| 0.8097222222222222 | 3.525 |
| 0.8104166666666667 | 0 |
| 0.811111111111111 | 3.525 |
| 0.8118055555555556 | 3.525 |
| 0.8125 | 3.525 |
| 0.8131944444444444 | 3.525 |
| 0.813888888888889 | 3.525 |
| 0.8145833333333333 | 3.525 |
| 0.8152777777777778 | 3.525 |
| 0.8159722222222222 | 3.525 |
| 0.8166666666666668 | 3.525 |
| 0.8173611111111111 | 3.525 |
| 0.8180555555555555 | 3.525 |
| 0.81875 | 3.525 |
| 0.8194444444444445 | 3.525 |
| 0.8201388888888889 | 3.525 |
| 0.8208333333333333 | 3.525 |
| 0.8215277777777777 | 3.525 |
| 0.8222222222222223 | 3.525 |
| 0.8229166666666666 | 3.525 |
| 0.8236111111111111 | 3.525 |
| 0.8243055555555556 | 3.525 |
| 0.8250000000000001 | 3.525 |
| 0.8256944444444444 | 3.525 |
| 0.8263888888888888 | 3.525 |
| 0.8270833333333334 | 3.525 |
| 0.8277777777777778 | 3.525 |
| 0.8284722222222222 | 3.525 |
| 0.8291666666666666 | 3.525 |
| 0.8298611111111112 | 3.525 |
| 0.8305555555555556 | 0 |
| 0.8312499999999999 | 0 |
| 0.8319444444444444 | 0 |
| 0.8326388888888889 | 0 |
| 0.8333333333333334 | 0 |
| 0.8340277777777777 | 0 |
| 0.8347222222222223 | 0 |
| 0.8354166666666667 | 0 |
| 0.8361111111111111 | 0 |
| 0.8368055555555555 | 0 |
| 0.8375 | 0 |
| 0.8381944444444445 | 0 |
| 0.8388888888888889 | 0 |
| 0.8395833333333332 | 0 |
| 0.8402777777777778 | 0 |
| 0.8409722222222222 | 0 |
| 0.8416666666666667 | 0 |
| 0.842361111111111 | 0 |
| 0.8430555555555556 | 0 |
| 0.84375 | 0 |
| 0.8444444444444444 | 0 |
| 0.845138888888889 | 0 |
| 0.8458333333333333 | 0 |
| 0.8465277777777778 | 0 |
| 0.8472222222222222 | 0 |
| 0.8479166666666668 | 0 |
| 0.8486111111111111 | 0 |
| 0.8493055555555555 | 0 |
| 0.85 | 0 |
| 0.8506944444444445 | 0 |
| 0.8513888888888889 | 0 |
| 0.8520833333333333 | 0 |
| 0.8527777777777777 | 0 |
| 0.8534722222222223 | 0 |
| 0.8541666666666666 | 0 |
| 0.8548611111111111 | 0 |
| 0.8555555555555556 | 0 |
| 0.8562500000000001 | 0 |
| 0.8569444444444444 | 0 |
| 0.8576388888888888 | 0 |
| 0.8583333333333334 | 0 |
| 0.8590277777777778 | 0 |
| 0.8597222222222222 | 0 |
| 0.8604166666666666 | 0 |
| 0.8611111111111112 | 0 |
| 0.8618055555555556 | 0 |
| 0.8624999999999999 | 0 |
| 0.8631944444444444 | 0 |
| 0.8638888888888889 | 0 |
| 0.8645833333333334 | 0 |
| 0.8652777777777777 | 0 |
| 0.8659722222222223 | 0 |
| 0.8666666666666667 | 0 |
| 0.8673611111111111 | 0 |
| 0.8680555555555555 | 0 |
| 0.86875 | 0 |
| 0.8694444444444445 | 0 |
| 0.8701388888888889 | 0 |
| 0.8708333333333332 | 0 |
| 0.8715277777777778 | 0 |
| 0.8722222222222222 | 0 |
| 0.8729166666666667 | 0 |
| 0.873611111111111 | 0 |
| 0.8743055555555556 | 0 |
| 0.875 | 0 |
| 0.8756944444444444 | 0 |
| 0.876388888888889 | 0 |
| 0.8770833333333333 | 0 |
| 0.8777777777777778 | 0 |
| 0.8784722222222222 | 0 |
| 0.8791666666666668 | 0 |
| 0.8798611111111111 | 0 |
| 0.8805555555555555 | 0 |
| 0.88125 | 0 |
| 0.8819444444444445 | 0 |
| 0.8826388888888889 | 0 |
| 0.8833333333333333 | 0 |
| 0.8840277777777777 | 0 |
| 0.8847222222222223 | 0 |
| 0.8854166666666666 | 0 |
| 0.8861111111111111 | 0 |
| 0.8868055555555556 | 0 |
| 0.8875000000000001 | 0 |
| 0.8881944444444444 | 0 |
| 0.8888888888888888 | 0 |
| 0.8895833333333334 | 0 |
| 0.8902777777777778 | 0 |
| 0.8909722222222222 | 0 |
| 0.8916666666666666 | 0 |
| 0.8923611111111112 | 0 |
| 0.8930555555555556 | 0 |
| 0.8937499999999999 | 0 |
| 0.8944444444444444 | 0 |
| 0.8951388888888889 | 0 |
| 0.8958333333333334 | 0 |
| 0.8965277777777777 | 0 |
| 0.8972222222222223 | 0 |
| 0.8979166666666667 | 0 |
| 0.8986111111111111 | 0 |
| 0.8993055555555555 | 0 |
| 0.9 | 0 |
| 0.9006944444444445 | 0 |
| 0.9013888888888889 | 0 |
| 0.9020833333333332 | 0 |
| 0.9027777777777778 | 0 |
| 0.9034722222222222 | 0 |
| 0.9041666666666667 | 0 |
| 0.904861111111111 | 0 |
| 0.9055555555555556 | 0 |
| 0.90625 | 0 |
| 0.9069444444444444 | 0 |
| 0.907638888888889 | 0 |
| 0.9083333333333333 | 0 |
| 0.9090277777777778 | 0 |
| 0.9097222222222222 | 0 |
| 0.9104166666666668 | 0 |
| 0.9111111111111111 | 0 |
| 0.9118055555555555 | 0 |
| 0.9125 | 0 |
| 0.9131944444444445 | 0 |
| 0.9138888888888889 | 0 |
| 0.9145833333333333 | 0 |
| 0.9152777777777777 | 0 |
| 0.9159722222222223 | 0 |
| 0.9166666666666666 | 0 |
| 0.9173611111111111 | 0 |
| 0.9180555555555556 | 0 |
| 0.9187500000000001 | 0 |
| 0.9194444444444444 | 0 |
| 0.9201388888888888 | 0 |
| 0.9208333333333334 | 0 |
| 0.9215277777777778 | 0 |
| 0.9222222222222222 | 0 |
| 0.9229166666666666 | 0 |
| 0.9236111111111112 | 0 |
| 0.9243055555555556 | 0 |
| 0.9249999999999999 | 0 |
| 0.9256944444444444 | 0 |
| 0.9263888888888889 | 0 |
| 0.9270833333333334 | 0 |
| 0.9277777777777777 | 0 |
| 0.9284722222222223 | 0 |
| 0.9291666666666667 | 0 |
| 0.9298611111111111 | 0 |
| 0.9305555555555555 | 0 |
| 0.93125 | 0 |
| 0.9319444444444445 | 0 |
| 0.9326388888888889 | 0 |
| 0.9333333333333332 | 0 |
| 0.9340277777777778 | 0 |
| 0.9347222222222222 | 0 |
| 0.9354166666666667 | 0 |
| 0.936111111111111 | 0 |
| 0.9368055555555556 | 0 |
| 0.9375 | 0 |
| 0.9381944444444444 | 0 |
| 0.938888888888889 | 0 |
| 0.9395833333333333 | 0 |
| 0.9402777777777778 | 0 |
| 0.9409722222222222 | 0 |
| 0.9416666666666668 | 0 |
| 0.9423611111111111 | 0 |
| 0.9430555555555555 | 0 |
| 0.94375 | 0 |
| 0.9444444444444445 | 0 |
| 0.9451388888888889 | 0 |
| 0.9458333333333333 | 0 |
| 0.9465277777777777 | 0 |
| 0.9472222222222223 | 0 |
| 0.9479166666666666 | 0 |
| 0.9486111111111111 | 0 |
| 0.9493055555555556 | 0 |
| 0.9500000000000001 | 0 |
| 0.9506944444444444 | 0 |
| 0.9513888888888888 | 0 |
| 0.9520833333333334 | 0 |
| 0.9527777777777778 | 0 |
| 0.9534722222222222 | 0 |
| 0.9541666666666666 | 0 |
| 0.9548611111111112 | 0 |
| 0.9555555555555556 | 0 |
| 0.9562499999999999 | 0 |
| 0.9569444444444444 | 0 |
| 0.9576388888888889 | 0 |
| 0.9583333333333334 | 0 |
| 0.9590277777777777 | 0 |
| 0.9597222222222223 | 0 |
| 0.9604166666666667 | 0 |
| 0.9611111111111111 | 0 |
| 0.9618055555555555 | 0 |
| 0.9625 | 0 |
| 0.9631944444444445 | 0 |
| 0.9638888888888889 | 0 |
| 0.9645833333333332 | 0 |
| 0.9652777777777778 | 0 |
| 0.9659722222222222 | 0 |
| 0.9666666666666667 | 0 |
| 0.967361111111111 | 0 |
| 0.9680555555555556 | 0 |
| 0.96875 | 0 |
| 0.9694444444444444 | 0 |
| 0.970138888888889 | 0 |
| 0.9708333333333333 | 0 |
| 0.9715277777777778 | 0 |
| 0.9722222222222222 | 0 |
| 0.9729166666666668 | 0 |
| 0.9736111111111111 | 0 |
| 0.9743055555555555 | 0 |
| 0.975 | 0 |
| 0.9756944444444445 | 0 |
| 0.9763888888888889 | 0 |
| 0.9770833333333333 | 0 |
| 0.9777777777777777 | 0 |
| 0.9784722222222223 | 0 |
| 0.9791666666666666 | 0 |
| 0.9798611111111111 | 0 |
| 0.9805555555555556 | 0 |
| 0.9812500000000001 | 0 |
| 0.9819444444444444 | 0 |
| 0.9826388888888888 | 0 |
| 0.9833333333333334 | 0 |
| 0.9840277777777778 | 0 |
| 0.9847222222222222 | 0 |
| 0.9854166666666666 | 0 |
| 0.9861111111111112 | 0 |
| 0.9868055555555556 | 0 |
| 0.9874999999999999 | 0 |
| 0.9881944444444444 | 0 |
| 0.9888888888888889 | 0 |
| 0.9895833333333334 | 0 |
| 0.9902777777777777 | 0 |
| 0.9909722222222223 | 0 |
| 0.9916666666666667 | 0 |
| 0.9923611111111111 | 0 |
| 0.9930555555555555 | 0 |
| 0.99375 | 0 |
| 0.9944444444444445 | 0 |
| 0.9951388888888889 | 0 |
| 0.9958333333333332 | 0 |
| 0.9965277777777778 | 0 |
| 0.9972222222222222 | 0 |
| 0.9979166666666667 | 0 |
| 0.998611111111111 | 0 |
| 0.9993055555555556 | 0 |